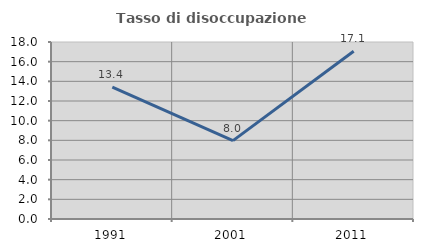
| Category | Tasso di disoccupazione giovanile  |
|---|---|
| 1991.0 | 13.399 |
| 2001.0 | 7.973 |
| 2011.0 | 17.06 |